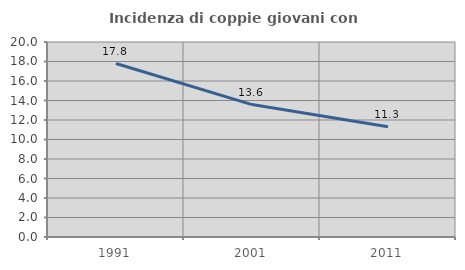
| Category | Incidenza di coppie giovani con figli |
|---|---|
| 1991.0 | 17.793 |
| 2001.0 | 13.583 |
| 2011.0 | 11.317 |